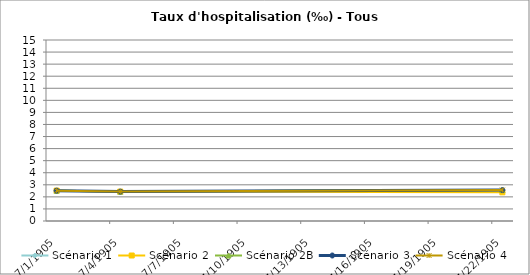
| Category | Scénario 1 | Scénario 2 | Scénario 2B | Scénario 3 | Scénario 4 |
|---|---|---|---|---|---|
| 2009.0 | 2.517 | 2.517 | 2.517 | 2.517 | 2.517 |
| 2012.0 | 2.436 | 2.436 | 2.436 | 2.436 | 2.436 |
| 2030.0 | 2.565 | 2.377 | 2.565 | 2.565 | 2.565 |